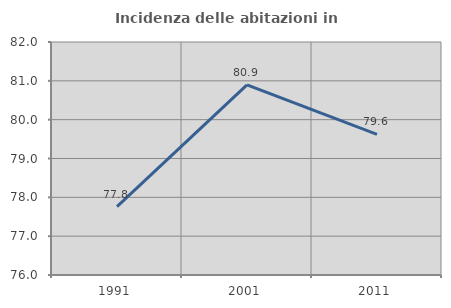
| Category | Incidenza delle abitazioni in proprietà  |
|---|---|
| 1991.0 | 77.762 |
| 2001.0 | 80.894 |
| 2011.0 | 79.622 |